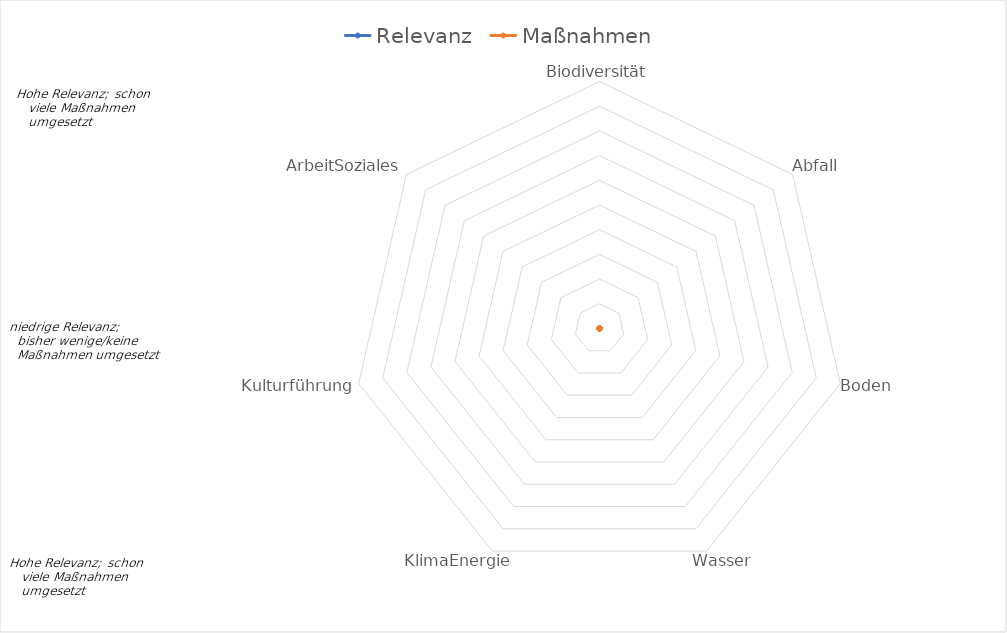
| Category | Relevanz | Maßnahmen |
|---|---|---|
| Biodiversität | 0 | 0 |
| Abfall | 0 | 0 |
| Boden | 0 | 0 |
| Wasser | 0 | 0 |
| KlimaEnergie | 0 | 0 |
| Kulturführung | 0 | 0 |
| ArbeitSoziales | 0 | 0 |